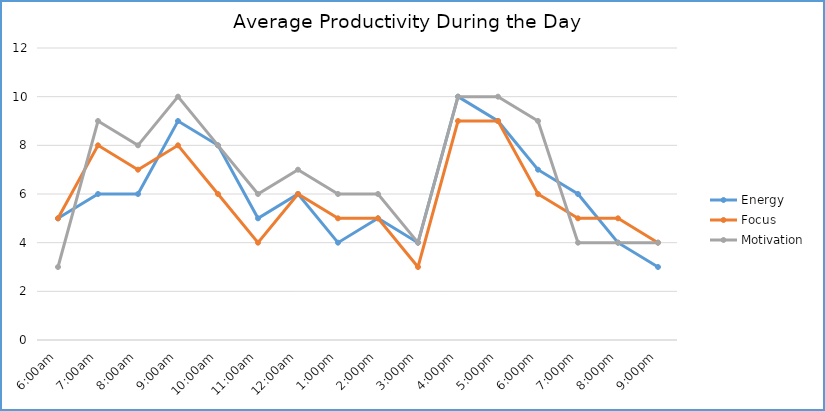
| Category | Energy | Focus | Motivation |
|---|---|---|---|
| 6:00am | 5 | 5 | 3 |
| 7:00am | 6 | 8 | 9 |
| 8:00am | 6 | 7 | 8 |
| 9:00am | 9 | 8 | 10 |
| 10:00am | 8 | 6 | 8 |
| 11:00am | 5 | 4 | 6 |
| 12:00am | 6 | 6 | 7 |
| 1:00pm | 4 | 5 | 6 |
| 2:00pm | 5 | 5 | 6 |
| 3:00pm | 4 | 3 | 4 |
| 4:00pm | 10 | 9 | 10 |
| 5:00pm | 9 | 9 | 10 |
| 6:00pm | 7 | 6 | 9 |
| 7:00pm | 6 | 5 | 4 |
| 8:00pm | 4 | 5 | 4 |
| 9:00pm | 3 | 4 | 4 |